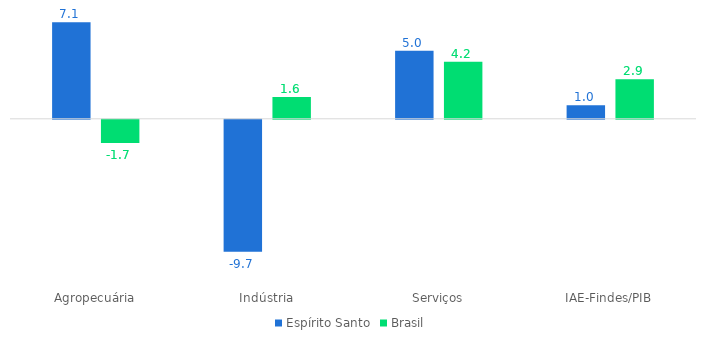
| Category | Espírito Santo | Brasil |
|---|---|---|
| Agropecuária | 7.1 | -1.7 |
| Indústria | -9.7 | 1.6 |
| Serviços | 5 | 4.2 |
| IAE-Findes/PIB | 1 | 2.9 |